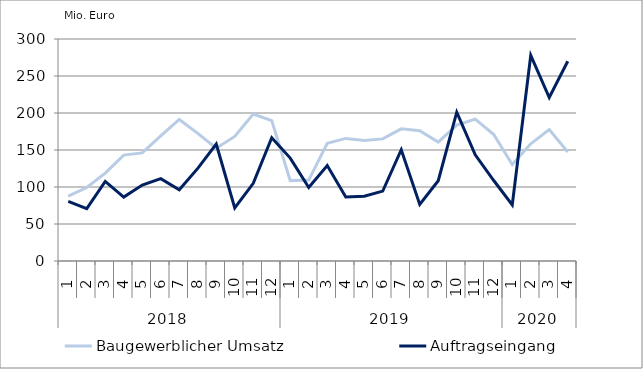
| Category | Baugewerblicher Umsatz | Auftragseingang |
|---|---|---|
| 0 | 87640.529 | 80684.627 |
| 1 | 99259.455 | 70746.763 |
| 2 | 118764.324 | 107538.747 |
| 3 | 143144.178 | 86374.619 |
| 4 | 146070.782 | 102661.329 |
| 5 | 169150.753 | 111287.709 |
| 6 | 191277.885 | 96286.662 |
| 7 | 172425.535 | 125142.495 |
| 8 | 152354.98 | 158112.302 |
| 9 | 168372.756 | 71808.619 |
| 10 | 198558.472 | 104904.147 |
| 11 | 189665.914 | 166653.461 |
| 12 | 108616.605 | 139065.287 |
| 13 | 109331.58 | 99318.609 |
| 14 | 159117.81 | 129002.041 |
| 15 | 165654.287 | 86579.2 |
| 16 | 162976.056 | 87644.362 |
| 17 | 165026.188 | 94463.186 |
| 18 | 178622.938 | 150345.08 |
| 19 | 176074.101 | 76434.317 |
| 20 | 160663.041 | 108444.162 |
| 21 | 183589.485 | 201122.697 |
| 22 | 191777.213 | 143514.792 |
| 23 | 170885.223 | 108780.022 |
| 24 | 130445.562 | 75891.481 |
| 25 | 158433.655 | 277923.85 |
| 26 | 177529.832 | 220973.626 |
| 27 | 147259.799 | 269936.091 |